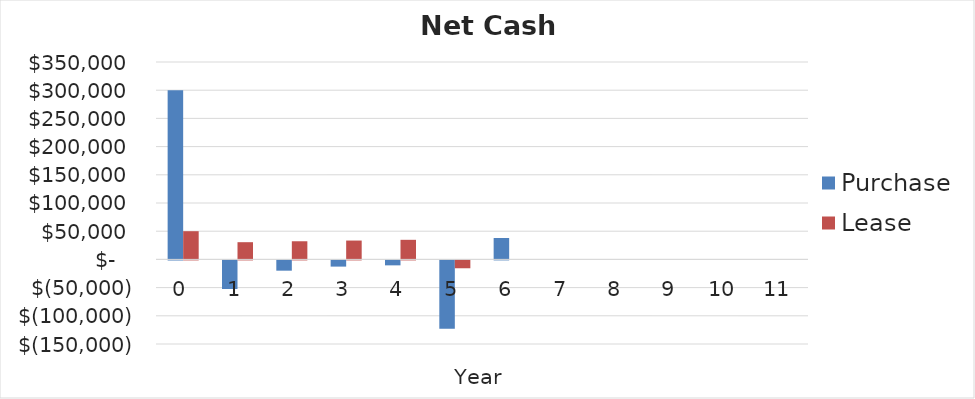
| Category | Purchase | Lease |
|---|---|---|
| 0.0 | 300000 | 50000 |
| 1.0 | -50670.1 | 30511.5 |
| 2.0 | -18219.028 | 32170.742 |
| 3.0 | -11008.288 | 33418.001 |
| 4.0 | -8780.31 | 34718.326 |
| 5.0 | -121341.669 | -13942.892 |
| 6.0 | 37901.289 | 0 |
| 7.0 | 0 | 0 |
| 8.0 | 0 | 0 |
| 9.0 | 0 | 0 |
| 10.0 | 0 | 0 |
| 11.0 | 0 | 0 |